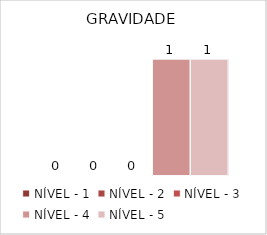
| Category | NÍVEL - 1 | NÍVEL - 2 | NÍVEL - 3 | NÍVEL - 4 | NÍVEL - 5 |
|---|---|---|---|---|---|
| GRAVIDADE | 0 | 0 | 0 | 1 | 1 |